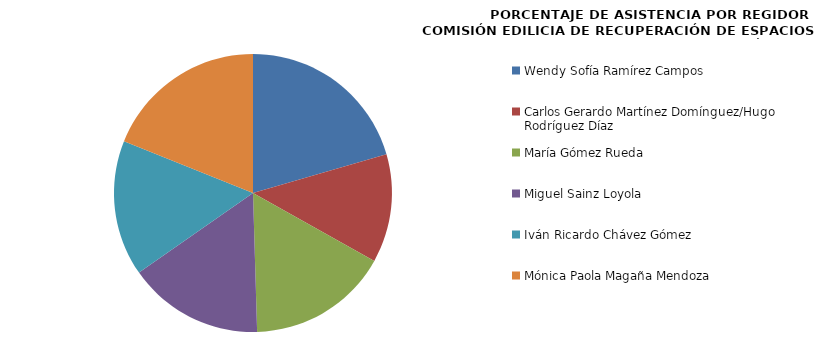
| Category | Series 0 |
|---|---|
| Wendy Sofía Ramírez Campos | 100 |
| Carlos Gerardo Martínez Domínguez/Hugo Rodríguez Díaz | 61.538 |
| María Gómez Rueda  | 80 |
| Miguel Sainz Loyola | 76.923 |
| Iván Ricardo Chávez Gómez | 76.923 |
| Mónica Paola Magaña Mendoza | 92.308 |